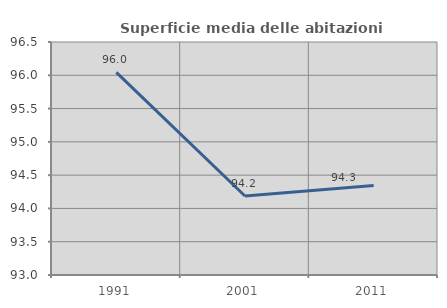
| Category | Superficie media delle abitazioni occupate |
|---|---|
| 1991.0 | 96.043 |
| 2001.0 | 94.187 |
| 2011.0 | 94.343 |